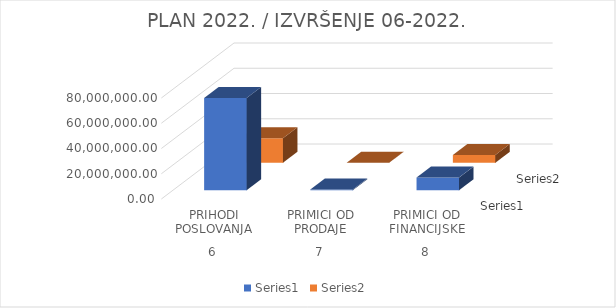
| Category | Series 0 | Series 1 |
|---|---|---|
| 0 | 73098950 | 19426020.68 |
| 1 | 532000 | 84716.5 |
| 2 | 10000000 | 6147612.41 |